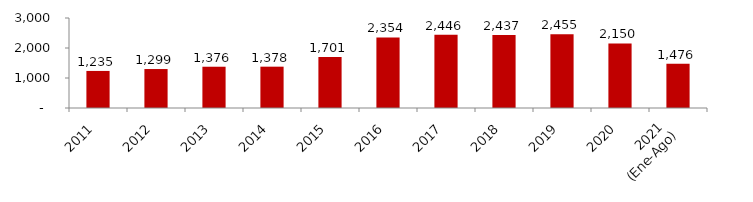
| Category | Series 0 |
|---|---|
| 2011 | 1235.345 |
| 2012 | 1298.761 |
| 2013 | 1375.641 |
| 2014 | 1377.642 |
| 2015 | 1700.817 |
| 2016 | 2353.859 |
| 2017 | 2445.584 |
| 2018 | 2437.035 |
| 2019 | 2455.44 |
| 2020 | 2150.126 |
| 2021 
(Ene-Ago) | 1476.179 |